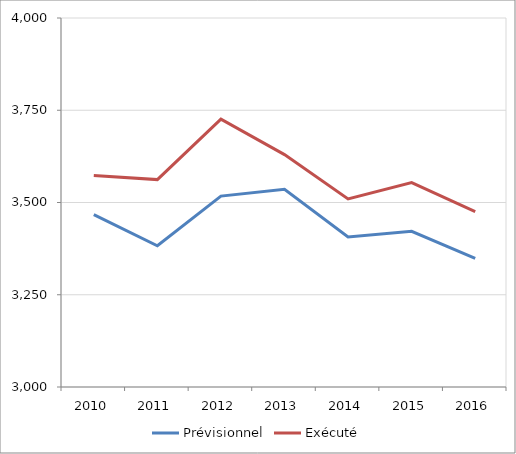
| Category | Prévisionnel | Exécuté |
|---|---|---|
| 2010.0 | 3467.209 | 3573.349 |
| 2011.0 | 3382.84 | 3562.094 |
| 2012.0 | 3517.393 | 3725.762 |
| 2013.0 | 3535.613 | 3629.773 |
| 2014.0 | 3406.815 | 3509.639 |
| 2015.0 | 3421.92 | 3554.135 |
| 2016.0 | 3348.615 | 3475.498 |